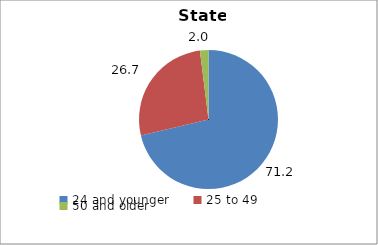
| Category | Series 0 | Series 1 |
|---|---|---|
| 24 and younger | 71.153 | 71.153 |
| 25 to 49 | 26.69 | 26.69 |
| 50 and older | 1.979 | 1.979 |